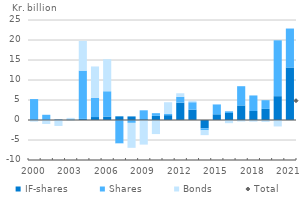
| Category | IF-shares | Shares | Bonds |
|---|---|---|---|
| 2000.0 | 0 | 5.23 | -0.408 |
| 2001.0 | 0 | 1.305 | -1.005 |
| 2002.0 | 0.119 | -0.026 | -1.459 |
| 2003.0 | 0.154 | -0.051 | 0.375 |
| 2004.0 | 0.275 | 12.073 | 7.423 |
| 2005.0 | 0.74 | 4.768 | 7.875 |
| 2006.0 | 0.872 | 6.312 | 8.007 |
| 2007.0 | 0.917 | -5.828 | -0.145 |
| 2008.0 | 0.895 | -0.721 | -6.23 |
| 2009.0 | 0.201 | 2.223 | -6.153 |
| 2010.0 | 1.04 | 0.669 | -3.519 |
| 2011.0 | 1.212 | 0.291 | 2.937 |
| 2012.0 | 4.342 | 1.464 | 0.877 |
| 2013.0 | 2.59 | 1.856 | 0.374 |
| 2014.0 | -2.07 | -0.503 | -1.208 |
| 2015.0 | 1.426 | 2.488 | 0.081 |
| 2016.0 | 1.752 | 0.419 | -0.798 |
| 2017.0 | 3.639 | 4.808 | -0.38 |
| 2018.0 | 2.251 | 3.888 | -0.417 |
| 2019.0 | 2.777 | 2.173 | -0.476 |
| 2020.0 | 5.958 | 13.958 | -1.612 |
| 2021.0 | 13.131 | 9.735 | -0.078 |